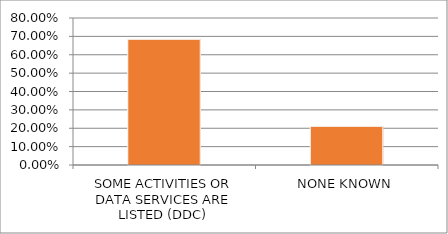
| Category | Series 0 |
|---|---|
| SOME ACTIVITIES OR DATA SERVICES ARE LISTED (DDC) | 0.684 |
| NONE KNOWN | 0.211 |